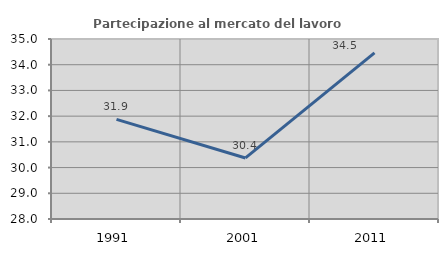
| Category | Partecipazione al mercato del lavoro  femminile |
|---|---|
| 1991.0 | 31.872 |
| 2001.0 | 30.374 |
| 2011.0 | 34.462 |